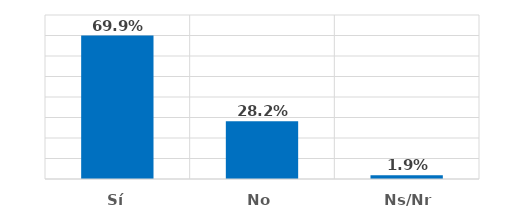
| Category | Series 0 |
|---|---|
| Sí | 0.699 |
| No | 0.282 |
| Ns/Nr | 0.019 |